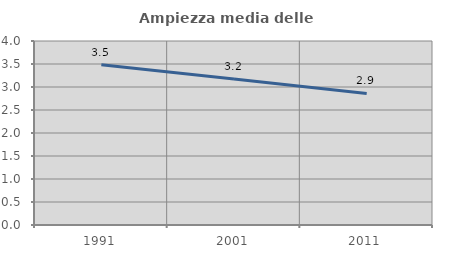
| Category | Ampiezza media delle famiglie |
|---|---|
| 1991.0 | 3.485 |
| 2001.0 | 3.173 |
| 2011.0 | 2.859 |